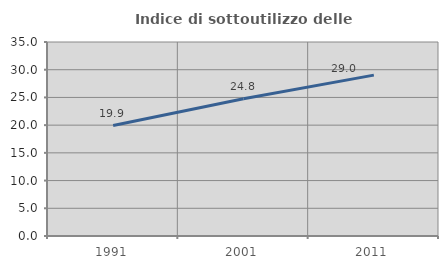
| Category | Indice di sottoutilizzo delle abitazioni  |
|---|---|
| 1991.0 | 19.919 |
| 2001.0 | 24.764 |
| 2011.0 | 29.026 |